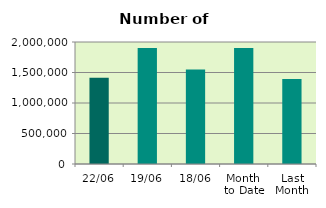
| Category | Series 0 |
|---|---|
| 22/06 | 1413876 |
| 19/06 | 1901474 |
| 18/06 | 1550150 |
| Month 
to Date | 1900525.75 |
| Last
Month | 1395416 |